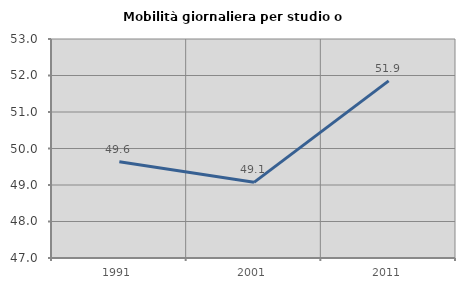
| Category | Mobilità giornaliera per studio o lavoro |
|---|---|
| 1991.0 | 49.635 |
| 2001.0 | 49.073 |
| 2011.0 | 51.852 |